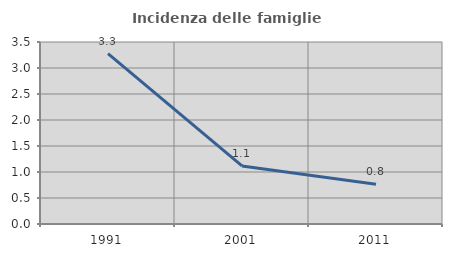
| Category | Incidenza delle famiglie numerose |
|---|---|
| 1991.0 | 3.275 |
| 2001.0 | 1.116 |
| 2011.0 | 0.766 |